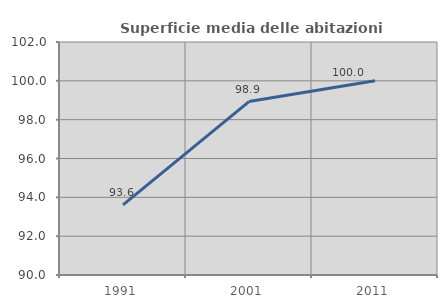
| Category | Superficie media delle abitazioni occupate |
|---|---|
| 1991.0 | 93.61 |
| 2001.0 | 98.933 |
| 2011.0 | 100.007 |